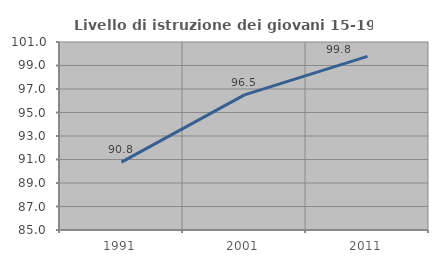
| Category | Livello di istruzione dei giovani 15-19 anni |
|---|---|
| 1991.0 | 90.773 |
| 2001.0 | 96.5 |
| 2011.0 | 99.782 |